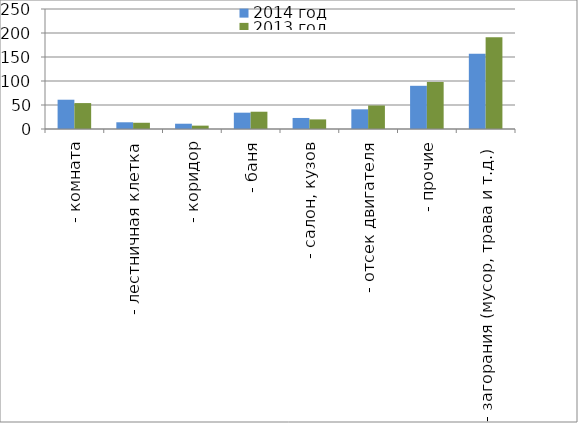
| Category | 2014 год | 2013 год |
|---|---|---|
|  - комната | 61 | 54 |
|  - лестничная клетка | 14 | 13 |
|  - коридор | 11 | 7 |
|  - баня | 34 | 36 |
|  - салон, кузов | 23 | 20 |
|  - отсек двигателя | 41 | 49 |
| - прочие | 90 | 98 |
| - загорания (мусор, трава и т.д.)  | 157 | 191 |